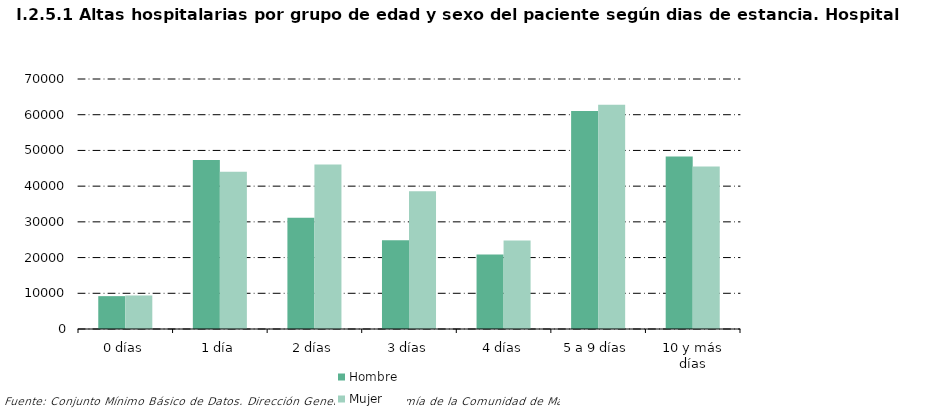
| Category |     Hombre |     Mujer |
|---|---|---|
| 0 | 9199 | 9385 |
| 1 | 47349 | 44005 |
| 2 | 31151 | 46029 |
| 3 | 24868 | 38590 |
| 4 | 20827 | 24812 |
| 5 | 61050 | 62806 |
| 6 | 48327 | 45466 |